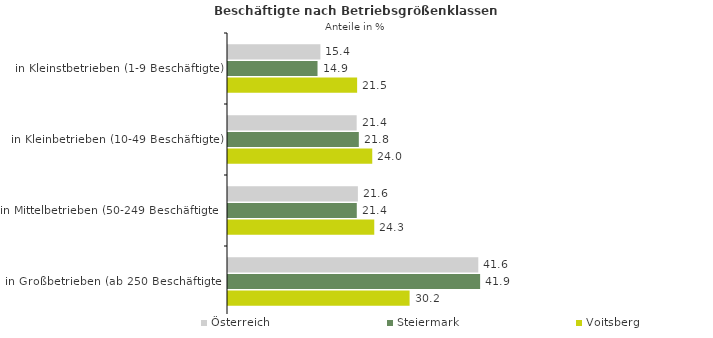
| Category | Österreich | Steiermark | Voitsberg |
|---|---|---|---|
| in Kleinstbetrieben (1-9 Beschäftigte) | 15.366 | 14.89 | 21.477 |
| in Kleinbetrieben (10-49 Beschäftigte) | 21.402 | 21.759 | 23.993 |
| in Mittelbetrieben (50-249 Beschäftigte) | 21.603 | 21.42 | 24.327 |
| in Großbetrieben (ab 250 Beschäftigte) | 41.629 | 41.932 | 30.203 |